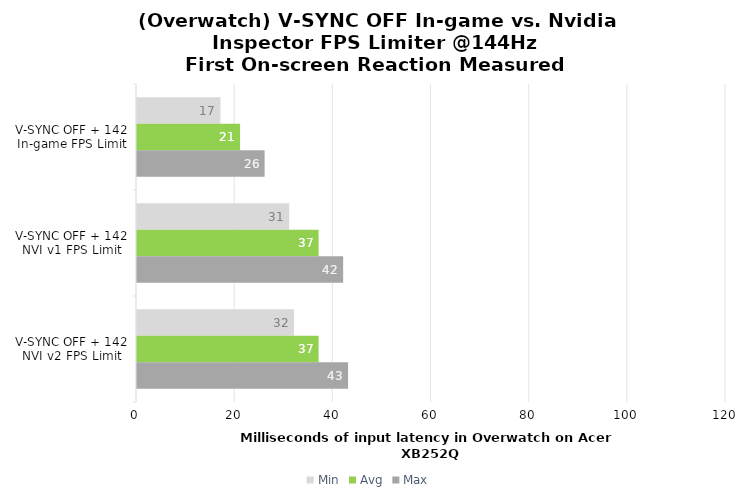
| Category | Min | Avg | Max |
|---|---|---|---|
| V-SYNC OFF + 142 In-game FPS Limit | 17 | 21 | 26 |
| V-SYNC OFF + 142 NVI v1 FPS Limit | 31 | 37 | 42 |
| V-SYNC OFF + 142 NVI v2 FPS Limit | 32 | 37 | 43 |